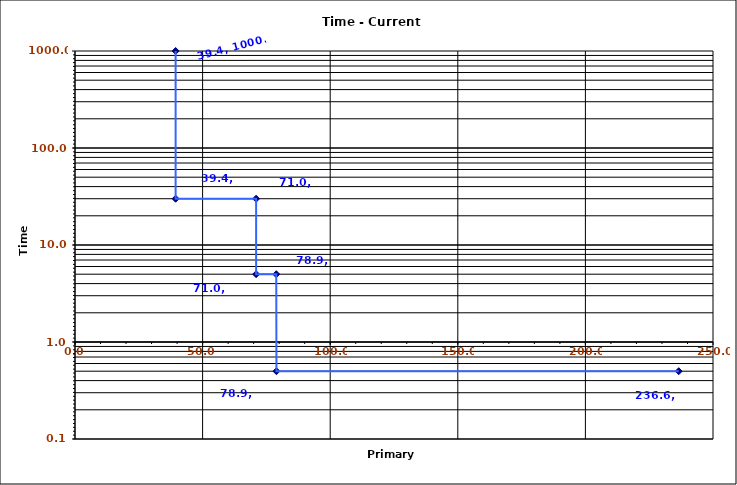
| Category | Series 0 |
|---|---|
| 39.42934266737839 | 1000 |
| 39.42934266737839 | 30 |
| 70.97281680128111 | 30.003 |
| 70.97675973554784 | 5 |
| 78.85868533475679 | 4.999 |
| 78.93754402009154 | 0.5 |
| 236.57605600427036 | 0.5 |